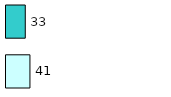
| Category | Series 0 | Series 1 |
|---|---|---|
| 0 | 41 | 33 |